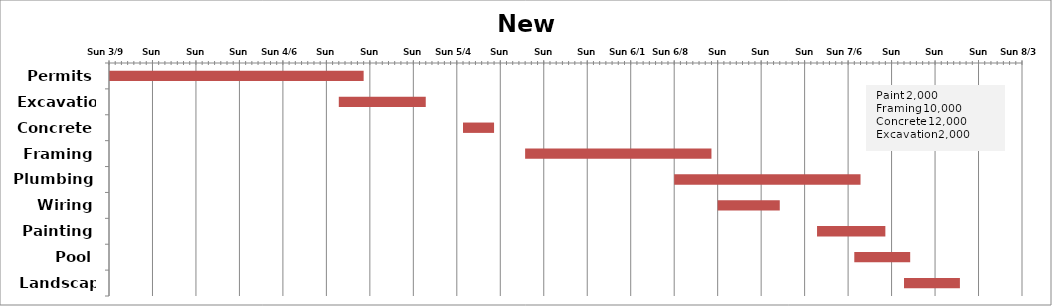
| Category | Start Date | Duration |
|---|---|---|
| Permits | 2014-03-09 | 41 |
| Excavation | 2014-04-15 | 14 |
| Concrete | 2014-05-05 | 5 |
| Framing | 2014-05-15 | 30 |
| Plumbing | 2014-06-08 | 30 |
| Wiring | 2014-06-15 | 10 |
| Painting | 2014-07-01 | 11 |
| Pool | 2014-07-07 | 9 |
| Landscape | 2014-07-15 | 9 |